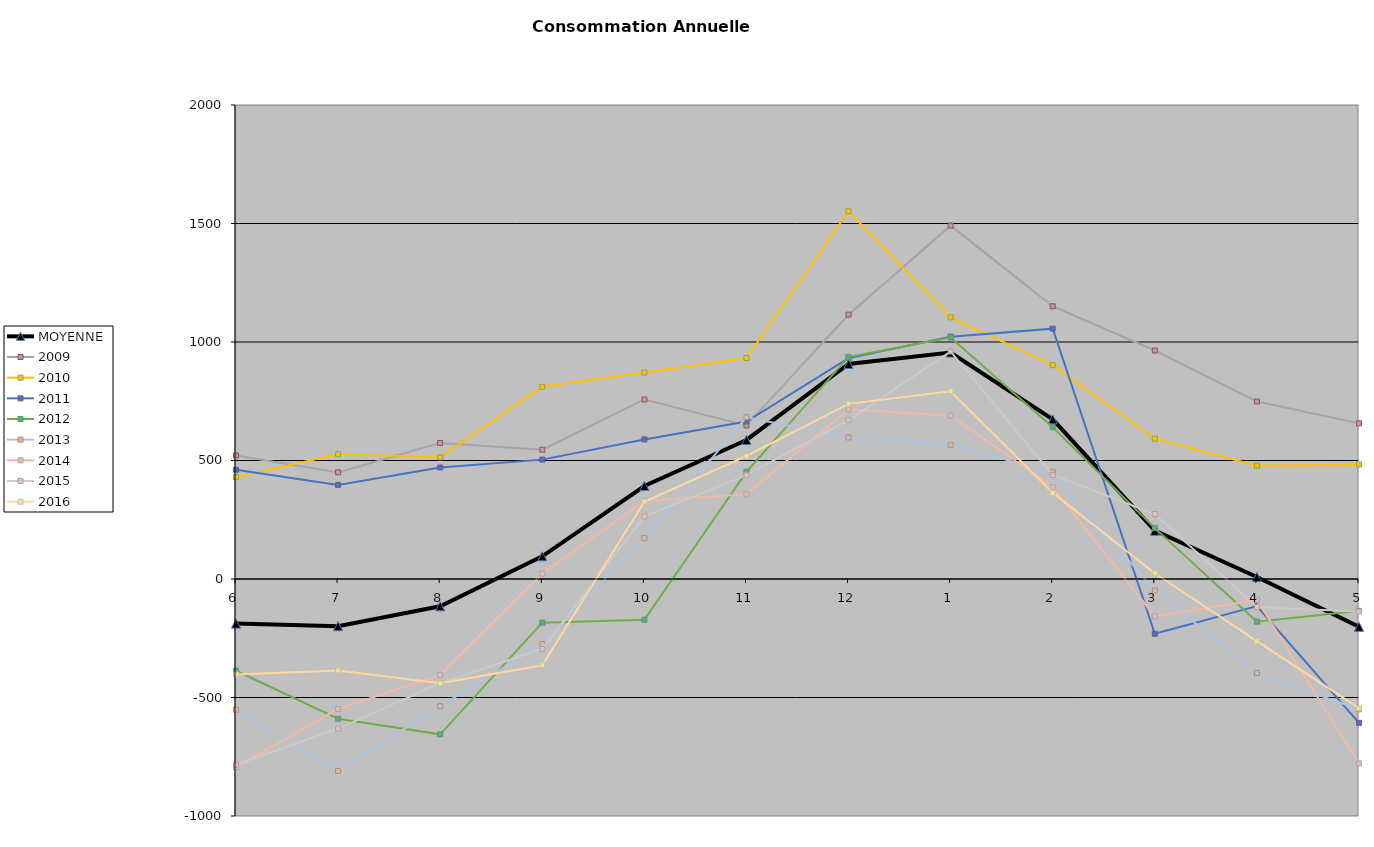
| Category | MOYENNE | 2009 | 2010 | 2011 | 2012 | 2013 | 2014 | 2015 | 2016 |
|---|---|---|---|---|---|---|---|---|---|
| 6 | -188.25 | 521.471 | 430.25 | 461 | -387.062 | -551.344 | -793.333 | -784 | -403.077 |
| 7 | -199.125 | 449.912 | 526.464 | 396.972 | -589.538 | -810 | -548.667 | -631 | -385.738 |
| 8 | -115 | 573.697 | 513.286 | 470.494 | -655.4 | -536.571 | -404.632 | -440.049 | -439.971 |
| 9 | 95.875 | 545.538 | 810.909 | 503.667 | -184.125 | -274.429 | 22.632 | -294.751 | -364.214 |
| 10 | 392.375 | 757.562 | 871.624 | 588.967 | -171.875 | 172.438 | 330 | 264.17 | 326 |
| 11 | 586.625 | 647.938 | 932.342 | 664.436 | 452 | 682.562 | 357 | 438.21 | 519.091 |
| 12 | 907.25 | 1115.5 | 1551.47 | 931.839 | 937 | 597 | 715.818 | 670.226 | 738.909 |
| 1 | 955.5 | 1491 | 1104.222 | 1022.625 | 1019 | 566 | 689.015 | 960.032 | 792.324 |
| 2 | 673.625 | 1150.8 | 902.033 | 1056.2 | 640.387 | 450 | 387.167 | 439.161 | 363.676 |
| 3 | 203.875 | 964.2 | 592 | -231.2 | 214.613 | -49 | -157.9 | 274.156 | 24.424 |
| 4 | 8.5 | 749.062 | 478.15 | -114 | -180 | -397 | -88.1 | -117.79 | -262.424 |
| 5 | -201.5 | 656.938 | 483.25 | -607 | -134.656 | -550 | -778 | -137.367 | -545 |